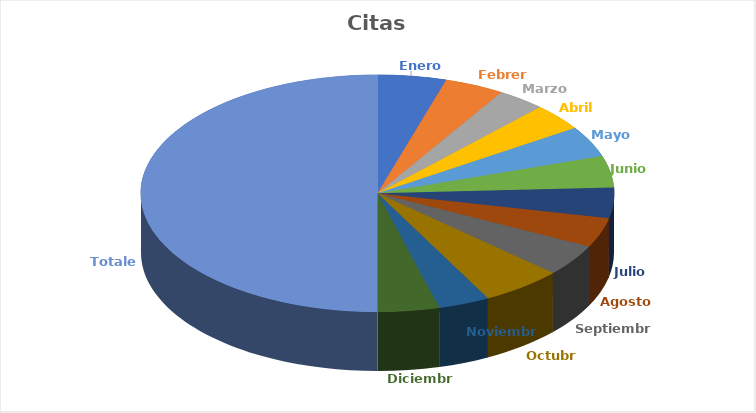
| Category | Citas Atendidas | Llamadas atendidas |
|---|---|---|
| Enero | 358 | 1874 |
| Febrero | 311 | 1996 |
| Marzo | 249 | 1806 |
| Abril | 280 | 1907 |
| Mayo | 321 | 1913 |
| Junio | 330 | 1848 |
| Julio | 319 | 2051 |
| Agosto | 308 | 1548 |
| Septiembre | 329 | 1861 |
| Octubre | 424 | 2265 |
| Noviembre | 268 | 2100 |
| Diciembre | 321 | 1664 |
| Totales | 3818 | 22860 |